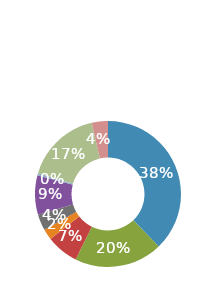
| Category | Series 0 |
|---|---|
| Home | 0.378 |
| Transportation | 0.195 |
| Groceries | 0.071 |
| Dining Out | 0.024 |
| Kids. | 0.036 |
| Personal | 0.087 |
| Special Events | 0.005 |
| Debt | 0.168 |
| Misc | 0.036 |